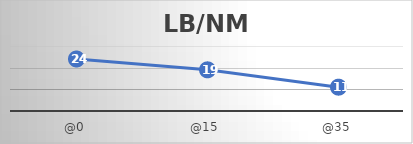
| Category | LB/NM |
|---|---|
| @0 | 24 |
| @15 | 19 |
| @35 | 11 |